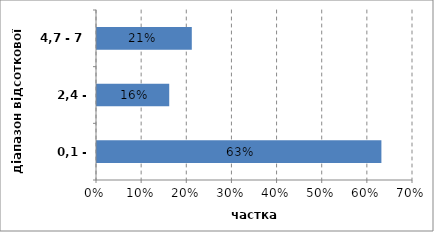
| Category | Series 0 |
|---|---|
| 0,1 - 2,4 | 0.63 |
| 2,4 - 4,7 | 0.16 |
| 4,7 - 7 | 0.21 |